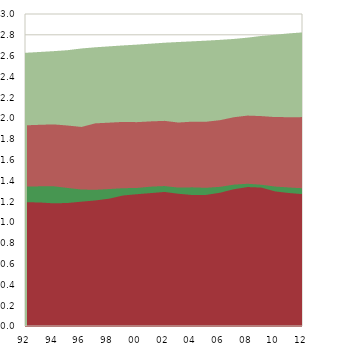
| Category | Beskæftigede | Arbejdsløse | Pensionister
og efterløns-
modtagere | Øvrige |
|---|---|---|---|---|
| 92 | 1.2 | 0.15 | 0.589 | 0.678 |
| 93 | 1.197 | 0.155 | 0.592 | 0.681 |
| 94 | 1.189 | 0.164 | 0.595 | 0.685 |
| 95 | 1.192 | 0.145 | 0.6 | 0.705 |
| 96 | 1.205 | 0.117 | 0.602 | 0.735 |
| 97 | 1.217 | 0.103 | 0.639 | 0.712 |
| 98 | 1.234 | 0.093 | 0.638 | 0.714 |
| 99 | 1.265 | 0.07 | 0.638 | 0.716 |
| 00 | 1.277 | 0.06 | 0.633 | 0.726 |
| 01 | 1.288 | 0.062 | 0.628 | 0.728 |
| 02 | 1.299 | 0.057 | 0.627 | 0.732 |
| 03 | 1.281 | 0.059 | 0.626 | 0.755 |
| 04 | 1.269 | 0.074 | 0.632 | 0.753 |
| 05 | 1.27 | 0.068 | 0.635 | 0.76 |
| 06 | 1.291 | 0.057 | 0.641 | 0.753 |
| 07 | 1.325 | 0.044 | 0.648 | 0.733 |
| 08 | 1.346 | 0.032 | 0.655 | 0.73 |
| 09 | 1.341 | 0.027 | 0.66 | 0.752 |
| 10 | 1.304 | 0.047 | 0.668 | 0.773 |
| 11 | 1.288 | 0.053 | 0.676 | 0.786 |
| 12 | 1.277 | 0.057 | 0.684 | 0.796 |